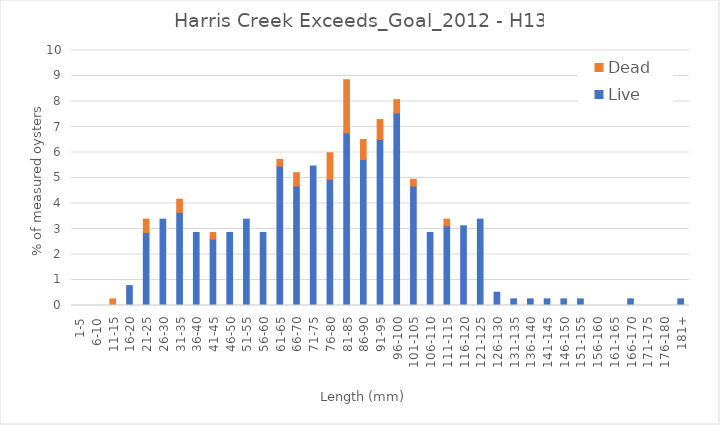
| Category | Live | Dead |
|---|---|---|
| 1-5 | 0 | 0 |
| 6-10 | 0 | 0 |
| 11-15 | 0 | 0.26 |
| 16-20 | 0.781 | 0 |
| 21-25 | 2.865 | 0.521 |
| 26-30 | 3.385 | 0 |
| 31-35 | 3.646 | 0.521 |
| 36-40 | 2.865 | 0 |
| 41-45 | 2.604 | 0.26 |
| 46-50 | 2.865 | 0 |
| 51-55 | 3.385 | 0 |
| 56-60 | 2.865 | 0 |
| 61-65 | 5.469 | 0.26 |
| 66-70 | 4.688 | 0.521 |
| 71-75 | 5.469 | 0 |
| 76-80 | 4.948 | 1.042 |
| 81-85 | 6.771 | 2.083 |
| 86-90 | 5.729 | 0.781 |
| 91-95 | 6.51 | 0.781 |
| 96-100 | 7.552 | 0.521 |
| 101-105 | 4.688 | 0.26 |
| 106-110 | 2.865 | 0 |
| 111-115 | 3.125 | 0.26 |
| 116-120 | 3.125 | 0 |
| 121-125 | 3.385 | 0 |
| 126-130 | 0.521 | 0 |
| 131-135 | 0.26 | 0 |
| 136-140 | 0.26 | 0 |
| 141-145 | 0.26 | 0 |
| 146-150 | 0.26 | 0 |
| 151-155 | 0.26 | 0 |
| 156-160 | 0 | 0 |
| 161-165 | 0 | 0 |
| 166-170 | 0.26 | 0 |
| 171-175 | 0 | 0 |
| 176-180 | 0 | 0 |
| 181+ | 0.26 | 0 |